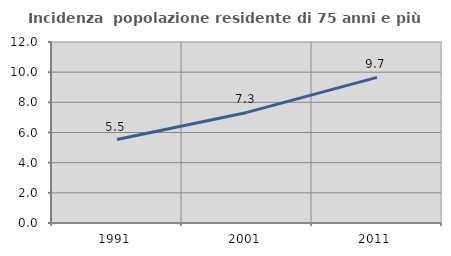
| Category | Incidenza  popolazione residente di 75 anni e più |
|---|---|
| 1991.0 | 5.534 |
| 2001.0 | 7.332 |
| 2011.0 | 9.656 |